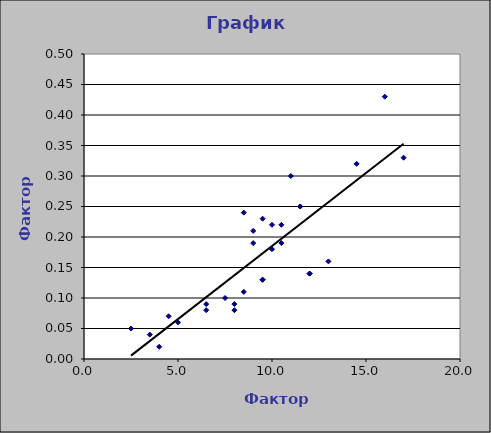
| Category | Series 0 |
|---|---|
| 6.5 | 0.09 |
| 13.0 | 0.16 |
| 4.0 | 0.02 |
| 11.5 | 0.25 |
| 17.0 | 0.33 |
| 3.5 | 0.04 |
| 8.0 | 0.08 |
| 12.0 | 0.14 |
| 7.5 | 0.1 |
| 9.5 | 0.13 |
| 8.5 | 0.11 |
| 10.5 | 0.19 |
| 5.0 | 0.06 |
| 4.5 | 0.07 |
| 8.0 | 0.09 |
| 9.5 | 0.13 |
| 10.5 | 0.22 |
| 12.0 | 0.14 |
| 10.0 | 0.18 |
| 6.5 | 0.08 |
| 2.5 | 0.05 |
| 16.0 | 0.43 |
| 8.5 | 0.24 |
| 9.5 | 0.23 |
| 11.0 | 0.3 |
| 9.0 | 0.21 |
| 14.5 | 0.32 |
| 11.5 | 0.25 |
| 10.0 | 0.22 |
| 9.0 | 0.19 |